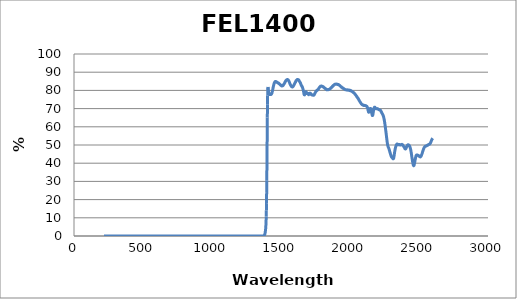
| Category | Series 0 |
|---|---|
| 2600.0 | 53.702 |
| 2599.0 | 53.601 |
| 2598.0 | 53.547 |
| 2597.0 | 53.429 |
| 2596.0 | 53.299 |
| 2595.0 | 53.191 |
| 2594.0 | 53.019 |
| 2593.0 | 52.975 |
| 2592.0 | 52.693 |
| 2591.0 | 52.558 |
| 2590.0 | 52.392 |
| 2589.0 | 52.176 |
| 2588.0 | 52.01 |
| 2587.0 | 51.898 |
| 2586.0 | 51.696 |
| 2585.0 | 51.437 |
| 2584.0 | 51.294 |
| 2583.0 | 51.16 |
| 2582.0 | 50.989 |
| 2581.0 | 50.836 |
| 2580.0 | 50.768 |
| 2579.0 | 50.635 |
| 2578.0 | 50.54 |
| 2577.0 | 50.472 |
| 2576.0 | 50.473 |
| 2575.0 | 50.437 |
| 2574.0 | 50.365 |
| 2573.0 | 50.402 |
| 2572.0 | 50.363 |
| 2571.0 | 50.339 |
| 2570.0 | 50.291 |
| 2569.0 | 50.251 |
| 2568.0 | 50.245 |
| 2567.0 | 50.118 |
| 2566.0 | 50.124 |
| 2565.0 | 50.035 |
| 2564.0 | 49.989 |
| 2563.0 | 49.877 |
| 2562.0 | 49.948 |
| 2561.0 | 49.817 |
| 2560.0 | 49.784 |
| 2559.0 | 49.782 |
| 2558.0 | 49.757 |
| 2557.0 | 49.689 |
| 2556.0 | 49.618 |
| 2555.0 | 49.544 |
| 2554.0 | 49.542 |
| 2553.0 | 49.45 |
| 2552.0 | 49.443 |
| 2551.0 | 49.421 |
| 2550.0 | 49.391 |
| 2549.0 | 49.399 |
| 2548.0 | 49.402 |
| 2547.0 | 49.347 |
| 2546.0 | 49.327 |
| 2545.0 | 49.232 |
| 2544.0 | 49.178 |
| 2543.0 | 49.087 |
| 2542.0 | 49.092 |
| 2541.0 | 48.93 |
| 2540.0 | 48.861 |
| 2539.0 | 48.759 |
| 2538.0 | 48.651 |
| 2537.0 | 48.433 |
| 2536.0 | 48.371 |
| 2535.0 | 48.127 |
| 2534.0 | 47.968 |
| 2533.0 | 47.78 |
| 2532.0 | 47.691 |
| 2531.0 | 47.353 |
| 2530.0 | 47.124 |
| 2529.0 | 46.902 |
| 2528.0 | 46.662 |
| 2527.0 | 46.427 |
| 2526.0 | 46.23 |
| 2525.0 | 45.944 |
| 2524.0 | 45.707 |
| 2523.0 | 45.471 |
| 2522.0 | 45.24 |
| 2521.0 | 45.029 |
| 2520.0 | 44.785 |
| 2519.0 | 44.584 |
| 2518.0 | 44.381 |
| 2517.0 | 44.177 |
| 2516.0 | 43.994 |
| 2515.0 | 43.894 |
| 2514.0 | 43.712 |
| 2513.0 | 43.629 |
| 2512.0 | 43.608 |
| 2511.0 | 43.536 |
| 2510.0 | 43.431 |
| 2509.0 | 43.492 |
| 2508.0 | 43.489 |
| 2507.0 | 43.487 |
| 2506.0 | 43.521 |
| 2505.0 | 43.594 |
| 2504.0 | 43.656 |
| 2503.0 | 43.727 |
| 2502.0 | 43.825 |
| 2501.0 | 43.916 |
| 2500.0 | 43.937 |
| 2499.0 | 44.09 |
| 2498.0 | 44.088 |
| 2497.0 | 44.07 |
| 2496.0 | 44.191 |
| 2495.0 | 44.239 |
| 2494.0 | 44.246 |
| 2493.0 | 44.307 |
| 2492.0 | 44.39 |
| 2491.0 | 44.416 |
| 2490.0 | 44.382 |
| 2489.0 | 44.427 |
| 2488.0 | 44.518 |
| 2487.0 | 44.522 |
| 2486.0 | 44.534 |
| 2485.0 | 44.558 |
| 2484.0 | 44.553 |
| 2483.0 | 44.551 |
| 2482.0 | 44.471 |
| 2481.0 | 44.379 |
| 2480.0 | 44.237 |
| 2479.0 | 44.136 |
| 2478.0 | 43.836 |
| 2477.0 | 43.573 |
| 2476.0 | 43.263 |
| 2475.0 | 42.968 |
| 2474.0 | 42.589 |
| 2473.0 | 42.219 |
| 2472.0 | 41.841 |
| 2471.0 | 41.418 |
| 2470.0 | 41.017 |
| 2469.0 | 40.601 |
| 2468.0 | 40.119 |
| 2467.0 | 39.754 |
| 2466.0 | 39.421 |
| 2465.0 | 39.109 |
| 2464.0 | 38.837 |
| 2463.0 | 38.701 |
| 2462.0 | 38.663 |
| 2461.0 | 38.625 |
| 2460.0 | 38.774 |
| 2459.0 | 38.909 |
| 2458.0 | 39.207 |
| 2457.0 | 39.498 |
| 2456.0 | 39.887 |
| 2455.0 | 40.297 |
| 2454.0 | 40.712 |
| 2453.0 | 41.162 |
| 2452.0 | 41.615 |
| 2451.0 | 42.094 |
| 2450.0 | 42.569 |
| 2449.0 | 43.072 |
| 2448.0 | 43.557 |
| 2447.0 | 44.132 |
| 2446.0 | 44.576 |
| 2445.0 | 45.125 |
| 2444.0 | 45.585 |
| 2443.0 | 46.081 |
| 2442.0 | 46.501 |
| 2441.0 | 47.038 |
| 2440.0 | 47.354 |
| 2439.0 | 47.697 |
| 2438.0 | 48.015 |
| 2437.0 | 48.326 |
| 2436.0 | 48.508 |
| 2435.0 | 48.773 |
| 2434.0 | 49.034 |
| 2433.0 | 49.145 |
| 2432.0 | 49.295 |
| 2431.0 | 49.508 |
| 2430.0 | 49.536 |
| 2429.0 | 49.692 |
| 2428.0 | 49.814 |
| 2427.0 | 49.871 |
| 2426.0 | 49.851 |
| 2425.0 | 50.009 |
| 2424.0 | 50.016 |
| 2423.0 | 50.088 |
| 2422.0 | 50.069 |
| 2421.0 | 50.087 |
| 2420.0 | 50.042 |
| 2419.0 | 50.082 |
| 2418.0 | 50.001 |
| 2417.0 | 49.943 |
| 2416.0 | 49.894 |
| 2415.0 | 49.777 |
| 2414.0 | 49.633 |
| 2413.0 | 49.535 |
| 2412.0 | 49.415 |
| 2411.0 | 49.127 |
| 2410.0 | 48.971 |
| 2409.0 | 48.805 |
| 2408.0 | 48.556 |
| 2407.0 | 48.387 |
| 2406.0 | 48.236 |
| 2405.0 | 48.041 |
| 2404.0 | 47.92 |
| 2403.0 | 47.913 |
| 2402.0 | 47.837 |
| 2401.0 | 47.801 |
| 2400.0 | 47.923 |
| 2399.0 | 47.939 |
| 2398.0 | 47.989 |
| 2397.0 | 48.216 |
| 2396.0 | 48.319 |
| 2395.0 | 48.439 |
| 2394.0 | 48.597 |
| 2393.0 | 48.72 |
| 2392.0 | 48.783 |
| 2391.0 | 48.99 |
| 2390.0 | 49.053 |
| 2389.0 | 49.16 |
| 2388.0 | 49.328 |
| 2387.0 | 49.449 |
| 2386.0 | 49.485 |
| 2385.0 | 49.695 |
| 2384.0 | 49.845 |
| 2383.0 | 49.955 |
| 2382.0 | 50.04 |
| 2381.0 | 50.152 |
| 2380.0 | 50.18 |
| 2379.0 | 50.259 |
| 2378.0 | 50.287 |
| 2377.0 | 50.271 |
| 2376.0 | 50.357 |
| 2375.0 | 50.312 |
| 2374.0 | 50.228 |
| 2373.0 | 50.235 |
| 2372.0 | 50.177 |
| 2371.0 | 50.13 |
| 2370.0 | 50.112 |
| 2369.0 | 50.102 |
| 2368.0 | 50.044 |
| 2367.0 | 49.996 |
| 2366.0 | 50.02 |
| 2365.0 | 49.943 |
| 2364.0 | 50.048 |
| 2363.0 | 49.992 |
| 2362.0 | 50.105 |
| 2361.0 | 50.245 |
| 2360.0 | 50.24 |
| 2359.0 | 50.237 |
| 2358.0 | 50.28 |
| 2357.0 | 50.328 |
| 2356.0 | 50.296 |
| 2355.0 | 50.299 |
| 2354.0 | 50.267 |
| 2353.0 | 50.155 |
| 2352.0 | 50.194 |
| 2351.0 | 50.153 |
| 2350.0 | 50.095 |
| 2349.0 | 50.14 |
| 2348.0 | 50.168 |
| 2347.0 | 50.264 |
| 2346.0 | 50.323 |
| 2345.0 | 50.406 |
| 2344.0 | 50.377 |
| 2343.0 | 50.515 |
| 2342.0 | 50.465 |
| 2341.0 | 50.538 |
| 2340.0 | 50.49 |
| 2339.0 | 50.446 |
| 2338.0 | 50.291 |
| 2337.0 | 50.193 |
| 2336.0 | 50.025 |
| 2335.0 | 49.855 |
| 2334.0 | 49.72 |
| 2333.0 | 49.43 |
| 2332.0 | 49.196 |
| 2331.0 | 48.976 |
| 2330.0 | 48.595 |
| 2329.0 | 48.341 |
| 2328.0 | 48.007 |
| 2327.0 | 47.59 |
| 2326.0 | 47.235 |
| 2325.0 | 46.799 |
| 2324.0 | 46.38 |
| 2323.0 | 45.818 |
| 2322.0 | 45.385 |
| 2321.0 | 44.869 |
| 2320.0 | 44.321 |
| 2319.0 | 43.798 |
| 2318.0 | 43.326 |
| 2317.0 | 42.976 |
| 2316.0 | 42.727 |
| 2315.0 | 42.508 |
| 2314.0 | 42.412 |
| 2313.0 | 42.399 |
| 2312.0 | 42.382 |
| 2311.0 | 42.454 |
| 2310.0 | 42.568 |
| 2309.0 | 42.69 |
| 2308.0 | 42.823 |
| 2307.0 | 42.949 |
| 2306.0 | 43.018 |
| 2305.0 | 43.118 |
| 2304.0 | 43.218 |
| 2303.0 | 43.294 |
| 2302.0 | 43.353 |
| 2301.0 | 43.447 |
| 2300.0 | 43.661 |
| 2299.0 | 43.764 |
| 2298.0 | 43.976 |
| 2297.0 | 44.143 |
| 2296.0 | 44.373 |
| 2295.0 | 44.61 |
| 2294.0 | 44.871 |
| 2293.0 | 45.141 |
| 2292.0 | 45.379 |
| 2291.0 | 45.649 |
| 2290.0 | 45.867 |
| 2289.0 | 46.181 |
| 2288.0 | 46.384 |
| 2287.0 | 46.658 |
| 2286.0 | 46.981 |
| 2285.0 | 47.227 |
| 2284.0 | 47.514 |
| 2283.0 | 47.764 |
| 2282.0 | 47.989 |
| 2281.0 | 48.185 |
| 2280.0 | 48.353 |
| 2279.0 | 48.596 |
| 2278.0 | 48.712 |
| 2277.0 | 48.9 |
| 2276.0 | 49.121 |
| 2275.0 | 49.358 |
| 2274.0 | 49.644 |
| 2273.0 | 49.866 |
| 2272.0 | 50.358 |
| 2271.0 | 50.798 |
| 2270.0 | 51.31 |
| 2269.0 | 51.858 |
| 2268.0 | 52.486 |
| 2267.0 | 53.139 |
| 2266.0 | 53.728 |
| 2265.0 | 54.295 |
| 2264.0 | 54.942 |
| 2263.0 | 55.612 |
| 2262.0 | 56.269 |
| 2261.0 | 56.829 |
| 2260.0 | 57.419 |
| 2259.0 | 58.092 |
| 2258.0 | 58.61 |
| 2257.0 | 59.296 |
| 2256.0 | 59.841 |
| 2255.0 | 60.39 |
| 2254.0 | 60.922 |
| 2253.0 | 61.48 |
| 2252.0 | 62.016 |
| 2251.0 | 62.532 |
| 2250.0 | 63.043 |
| 2249.0 | 63.442 |
| 2248.0 | 63.919 |
| 2247.0 | 64.271 |
| 2246.0 | 64.61 |
| 2245.0 | 64.955 |
| 2244.0 | 65.284 |
| 2243.0 | 65.604 |
| 2242.0 | 65.801 |
| 2241.0 | 66.024 |
| 2240.0 | 66.319 |
| 2239.0 | 66.426 |
| 2238.0 | 66.516 |
| 2237.0 | 66.764 |
| 2236.0 | 66.903 |
| 2235.0 | 67.03 |
| 2234.0 | 67.154 |
| 2233.0 | 67.25 |
| 2232.0 | 67.515 |
| 2231.0 | 67.563 |
| 2230.0 | 67.62 |
| 2229.0 | 67.87 |
| 2228.0 | 68.122 |
| 2227.0 | 68.139 |
| 2226.0 | 68.388 |
| 2225.0 | 68.56 |
| 2224.0 | 68.644 |
| 2223.0 | 68.755 |
| 2222.0 | 68.975 |
| 2221.0 | 69.09 |
| 2220.0 | 69.063 |
| 2219.0 | 69.168 |
| 2218.0 | 69.135 |
| 2217.0 | 69.209 |
| 2216.0 | 69.198 |
| 2215.0 | 69.284 |
| 2214.0 | 69.235 |
| 2213.0 | 69.357 |
| 2212.0 | 69.292 |
| 2211.0 | 69.335 |
| 2210.0 | 69.396 |
| 2209.0 | 69.394 |
| 2208.0 | 69.494 |
| 2207.0 | 69.577 |
| 2206.0 | 69.605 |
| 2205.0 | 69.555 |
| 2204.0 | 69.699 |
| 2203.0 | 69.766 |
| 2202.0 | 69.87 |
| 2201.0 | 69.893 |
| 2200.0 | 69.943 |
| 2199.0 | 69.955 |
| 2198.0 | 69.965 |
| 2197.0 | 69.998 |
| 2196.0 | 69.971 |
| 2195.0 | 69.924 |
| 2194.0 | 69.866 |
| 2193.0 | 69.872 |
| 2192.0 | 69.851 |
| 2191.0 | 69.867 |
| 2190.0 | 69.893 |
| 2189.0 | 69.903 |
| 2188.0 | 69.91 |
| 2187.0 | 69.973 |
| 2186.0 | 70.104 |
| 2185.0 | 70.167 |
| 2184.0 | 70.4 |
| 2183.0 | 70.479 |
| 2182.0 | 70.607 |
| 2181.0 | 70.65 |
| 2180.0 | 70.766 |
| 2179.0 | 70.795 |
| 2178.0 | 70.752 |
| 2177.0 | 70.751 |
| 2176.0 | 70.633 |
| 2175.0 | 70.412 |
| 2174.0 | 70.294 |
| 2173.0 | 69.939 |
| 2172.0 | 69.643 |
| 2171.0 | 69.256 |
| 2170.0 | 68.727 |
| 2169.0 | 68.196 |
| 2168.0 | 67.707 |
| 2167.0 | 67.207 |
| 2166.0 | 66.771 |
| 2165.0 | 66.41 |
| 2164.0 | 66.284 |
| 2163.0 | 66.179 |
| 2162.0 | 66.185 |
| 2161.0 | 66.331 |
| 2160.0 | 66.635 |
| 2159.0 | 66.974 |
| 2158.0 | 67.383 |
| 2157.0 | 67.844 |
| 2156.0 | 68.24 |
| 2155.0 | 68.618 |
| 2154.0 | 68.924 |
| 2153.0 | 69.322 |
| 2152.0 | 69.639 |
| 2151.0 | 69.846 |
| 2150.0 | 69.98 |
| 2149.0 | 70.102 |
| 2148.0 | 70.085 |
| 2147.0 | 70.085 |
| 2146.0 | 69.97 |
| 2145.0 | 69.873 |
| 2144.0 | 69.674 |
| 2143.0 | 69.441 |
| 2142.0 | 69.164 |
| 2141.0 | 68.973 |
| 2140.0 | 68.632 |
| 2139.0 | 68.452 |
| 2138.0 | 68.166 |
| 2137.0 | 68.04 |
| 2136.0 | 68.019 |
| 2135.0 | 68.016 |
| 2134.0 | 68.198 |
| 2133.0 | 68.499 |
| 2132.0 | 68.845 |
| 2131.0 | 69.085 |
| 2130.0 | 69.502 |
| 2129.0 | 69.898 |
| 2128.0 | 70.21 |
| 2127.0 | 70.489 |
| 2126.0 | 70.715 |
| 2125.0 | 70.869 |
| 2124.0 | 71.013 |
| 2123.0 | 71.106 |
| 2122.0 | 71.249 |
| 2121.0 | 71.257 |
| 2120.0 | 71.371 |
| 2119.0 | 71.297 |
| 2118.0 | 71.393 |
| 2117.0 | 71.388 |
| 2116.0 | 71.569 |
| 2115.0 | 71.507 |
| 2114.0 | 71.576 |
| 2113.0 | 71.591 |
| 2112.0 | 71.633 |
| 2111.0 | 71.683 |
| 2110.0 | 71.706 |
| 2109.0 | 71.67 |
| 2108.0 | 71.691 |
| 2107.0 | 71.729 |
| 2106.0 | 71.658 |
| 2105.0 | 71.681 |
| 2104.0 | 71.767 |
| 2103.0 | 71.766 |
| 2102.0 | 71.793 |
| 2101.0 | 71.754 |
| 2100.0 | 71.802 |
| 2099.0 | 71.793 |
| 2098.0 | 71.791 |
| 2097.0 | 71.836 |
| 2096.0 | 71.796 |
| 2095.0 | 71.971 |
| 2094.0 | 71.938 |
| 2093.0 | 71.971 |
| 2092.0 | 71.988 |
| 2091.0 | 72.074 |
| 2090.0 | 72.053 |
| 2089.0 | 72.216 |
| 2088.0 | 72.237 |
| 2087.0 | 72.292 |
| 2086.0 | 72.338 |
| 2085.0 | 72.408 |
| 2084.0 | 72.5 |
| 2083.0 | 72.575 |
| 2082.0 | 72.682 |
| 2081.0 | 72.758 |
| 2080.0 | 72.903 |
| 2079.0 | 73.033 |
| 2078.0 | 73.095 |
| 2077.0 | 73.219 |
| 2076.0 | 73.262 |
| 2075.0 | 73.483 |
| 2074.0 | 73.541 |
| 2073.0 | 73.726 |
| 2072.0 | 73.78 |
| 2071.0 | 73.949 |
| 2070.0 | 73.994 |
| 2069.0 | 74.149 |
| 2068.0 | 74.286 |
| 2067.0 | 74.426 |
| 2066.0 | 74.615 |
| 2065.0 | 74.786 |
| 2064.0 | 74.803 |
| 2063.0 | 74.955 |
| 2062.0 | 75.152 |
| 2061.0 | 75.234 |
| 2060.0 | 75.463 |
| 2059.0 | 75.488 |
| 2058.0 | 75.703 |
| 2057.0 | 75.833 |
| 2056.0 | 75.89 |
| 2055.0 | 75.928 |
| 2054.0 | 76.112 |
| 2053.0 | 76.122 |
| 2052.0 | 76.347 |
| 2051.0 | 76.428 |
| 2050.0 | 76.451 |
| 2049.0 | 76.57 |
| 2048.0 | 76.761 |
| 2047.0 | 76.925 |
| 2046.0 | 76.99 |
| 2045.0 | 77.014 |
| 2044.0 | 77.174 |
| 2043.0 | 77.308 |
| 2042.0 | 77.411 |
| 2041.0 | 77.512 |
| 2040.0 | 77.531 |
| 2039.0 | 77.699 |
| 2038.0 | 77.764 |
| 2037.0 | 77.85 |
| 2036.0 | 78.008 |
| 2035.0 | 78.179 |
| 2034.0 | 78.148 |
| 2033.0 | 78.31 |
| 2032.0 | 78.322 |
| 2031.0 | 78.415 |
| 2030.0 | 78.513 |
| 2029.0 | 78.603 |
| 2028.0 | 78.577 |
| 2027.0 | 78.73 |
| 2026.0 | 78.809 |
| 2025.0 | 78.861 |
| 2024.0 | 78.914 |
| 2023.0 | 78.914 |
| 2022.0 | 79.134 |
| 2021.0 | 79.072 |
| 2020.0 | 79.179 |
| 2019.0 | 79.202 |
| 2018.0 | 79.258 |
| 2017.0 | 79.34 |
| 2016.0 | 79.375 |
| 2015.0 | 79.41 |
| 2014.0 | 79.513 |
| 2013.0 | 79.549 |
| 2012.0 | 79.63 |
| 2011.0 | 79.647 |
| 2010.0 | 79.683 |
| 2009.0 | 79.671 |
| 2008.0 | 79.676 |
| 2007.0 | 79.902 |
| 2006.0 | 79.807 |
| 2005.0 | 79.878 |
| 2004.0 | 79.939 |
| 2003.0 | 79.801 |
| 2002.0 | 79.855 |
| 2001.0 | 79.888 |
| 2000.0 | 80.023 |
| 1999.0 | 80.088 |
| 1998.0 | 80.143 |
| 1997.0 | 79.948 |
| 1996.0 | 80.045 |
| 1995.0 | 80.077 |
| 1994.0 | 80.136 |
| 1993.0 | 80.09 |
| 1992.0 | 80.117 |
| 1991.0 | 80.176 |
| 1990.0 | 80.145 |
| 1989.0 | 80.153 |
| 1988.0 | 80.148 |
| 1987.0 | 80.234 |
| 1986.0 | 80.182 |
| 1985.0 | 80.228 |
| 1984.0 | 80.273 |
| 1983.0 | 80.207 |
| 1982.0 | 80.158 |
| 1981.0 | 80.312 |
| 1980.0 | 80.235 |
| 1979.0 | 80.245 |
| 1978.0 | 80.268 |
| 1977.0 | 80.159 |
| 1976.0 | 80.268 |
| 1975.0 | 80.244 |
| 1974.0 | 80.296 |
| 1973.0 | 80.248 |
| 1972.0 | 80.303 |
| 1971.0 | 80.319 |
| 1970.0 | 80.416 |
| 1969.0 | 80.322 |
| 1968.0 | 80.306 |
| 1967.0 | 80.393 |
| 1966.0 | 80.416 |
| 1965.0 | 80.506 |
| 1964.0 | 80.495 |
| 1963.0 | 80.545 |
| 1962.0 | 80.626 |
| 1961.0 | 80.644 |
| 1960.0 | 80.641 |
| 1959.0 | 80.737 |
| 1958.0 | 80.858 |
| 1957.0 | 80.822 |
| 1956.0 | 80.85 |
| 1955.0 | 80.943 |
| 1954.0 | 80.976 |
| 1953.0 | 81.023 |
| 1952.0 | 81.095 |
| 1951.0 | 81.042 |
| 1950.0 | 81.159 |
| 1949.0 | 81.309 |
| 1948.0 | 81.179 |
| 1947.0 | 81.306 |
| 1946.0 | 81.367 |
| 1945.0 | 81.346 |
| 1944.0 | 81.483 |
| 1943.0 | 81.479 |
| 1942.0 | 81.641 |
| 1941.0 | 81.599 |
| 1940.0 | 81.696 |
| 1939.0 | 81.713 |
| 1938.0 | 81.78 |
| 1937.0 | 81.971 |
| 1936.0 | 81.874 |
| 1935.0 | 82.086 |
| 1934.0 | 82.048 |
| 1933.0 | 82.211 |
| 1932.0 | 82.251 |
| 1931.0 | 82.312 |
| 1930.0 | 82.356 |
| 1929.0 | 82.474 |
| 1928.0 | 82.508 |
| 1927.0 | 82.61 |
| 1926.0 | 82.621 |
| 1925.0 | 82.714 |
| 1924.0 | 82.8 |
| 1923.0 | 82.805 |
| 1922.0 | 82.884 |
| 1921.0 | 82.869 |
| 1920.0 | 82.939 |
| 1919.0 | 83.107 |
| 1918.0 | 83.134 |
| 1917.0 | 83.083 |
| 1916.0 | 83.14 |
| 1915.0 | 83.241 |
| 1914.0 | 83.276 |
| 1913.0 | 83.122 |
| 1912.0 | 83.269 |
| 1911.0 | 83.315 |
| 1910.0 | 83.287 |
| 1909.0 | 83.385 |
| 1908.0 | 83.422 |
| 1907.0 | 83.417 |
| 1906.0 | 83.347 |
| 1905.0 | 83.365 |
| 1904.0 | 83.43 |
| 1903.0 | 83.409 |
| 1902.0 | 83.418 |
| 1901.0 | 83.43 |
| 1900.0 | 83.503 |
| 1899.0 | 83.467 |
| 1898.0 | 83.424 |
| 1897.0 | 83.46 |
| 1896.0 | 83.419 |
| 1895.0 | 83.407 |
| 1894.0 | 83.418 |
| 1893.0 | 83.362 |
| 1892.0 | 83.35 |
| 1891.0 | 83.384 |
| 1890.0 | 83.351 |
| 1889.0 | 83.287 |
| 1888.0 | 83.319 |
| 1887.0 | 83.153 |
| 1886.0 | 83.071 |
| 1885.0 | 83.084 |
| 1884.0 | 83.01 |
| 1883.0 | 82.862 |
| 1882.0 | 82.867 |
| 1881.0 | 82.818 |
| 1880.0 | 82.687 |
| 1879.0 | 82.738 |
| 1878.0 | 82.585 |
| 1877.0 | 82.437 |
| 1876.0 | 82.457 |
| 1875.0 | 82.306 |
| 1874.0 | 82.265 |
| 1873.0 | 82.17 |
| 1872.0 | 82.013 |
| 1871.0 | 81.983 |
| 1870.0 | 81.988 |
| 1869.0 | 81.758 |
| 1868.0 | 81.776 |
| 1867.0 | 81.651 |
| 1866.0 | 81.633 |
| 1865.0 | 81.625 |
| 1864.0 | 81.46 |
| 1863.0 | 81.471 |
| 1862.0 | 81.328 |
| 1861.0 | 81.276 |
| 1860.0 | 81.161 |
| 1859.0 | 81.15 |
| 1858.0 | 81.01 |
| 1857.0 | 81.038 |
| 1856.0 | 80.938 |
| 1855.0 | 80.874 |
| 1854.0 | 80.75 |
| 1853.0 | 80.801 |
| 1852.0 | 80.657 |
| 1851.0 | 80.638 |
| 1850.0 | 80.59 |
| 1849.0 | 80.585 |
| 1848.0 | 80.541 |
| 1847.0 | 80.463 |
| 1846.0 | 80.429 |
| 1845.0 | 80.458 |
| 1844.0 | 80.443 |
| 1843.0 | 80.368 |
| 1842.0 | 80.377 |
| 1841.0 | 80.418 |
| 1840.0 | 80.395 |
| 1839.0 | 80.367 |
| 1838.0 | 80.408 |
| 1837.0 | 80.435 |
| 1836.0 | 80.438 |
| 1835.0 | 80.458 |
| 1834.0 | 80.499 |
| 1833.0 | 80.475 |
| 1832.0 | 80.422 |
| 1831.0 | 80.342 |
| 1830.0 | 80.588 |
| 1829.0 | 80.546 |
| 1828.0 | 80.57 |
| 1827.0 | 80.608 |
| 1826.0 | 80.7 |
| 1825.0 | 80.745 |
| 1824.0 | 80.891 |
| 1823.0 | 80.906 |
| 1822.0 | 80.845 |
| 1821.0 | 80.966 |
| 1820.0 | 81.098 |
| 1819.0 | 81.162 |
| 1818.0 | 81.155 |
| 1817.0 | 81.191 |
| 1816.0 | 81.378 |
| 1815.0 | 81.253 |
| 1814.0 | 81.407 |
| 1813.0 | 81.47 |
| 1812.0 | 81.567 |
| 1811.0 | 81.625 |
| 1810.0 | 81.659 |
| 1809.0 | 81.777 |
| 1808.0 | 81.929 |
| 1807.0 | 81.84 |
| 1806.0 | 81.839 |
| 1805.0 | 81.958 |
| 1804.0 | 82.097 |
| 1803.0 | 82.068 |
| 1802.0 | 82.096 |
| 1801.0 | 82.117 |
| 1800.0 | 82.174 |
| 1799.0 | 82.226 |
| 1798.0 | 82.298 |
| 1797.0 | 82.328 |
| 1796.0 | 82.351 |
| 1795.0 | 82.292 |
| 1794.0 | 82.392 |
| 1793.0 | 82.357 |
| 1792.0 | 82.412 |
| 1791.0 | 82.312 |
| 1790.0 | 82.339 |
| 1789.0 | 82.337 |
| 1788.0 | 82.348 |
| 1787.0 | 82.299 |
| 1786.0 | 82.299 |
| 1785.0 | 82.091 |
| 1784.0 | 82.151 |
| 1783.0 | 82.109 |
| 1782.0 | 81.995 |
| 1781.0 | 81.956 |
| 1780.0 | 81.819 |
| 1779.0 | 81.654 |
| 1778.0 | 81.511 |
| 1777.0 | 81.466 |
| 1776.0 | 81.379 |
| 1775.0 | 81.222 |
| 1774.0 | 81.121 |
| 1773.0 | 81.051 |
| 1772.0 | 80.804 |
| 1771.0 | 80.714 |
| 1770.0 | 80.562 |
| 1769.0 | 80.576 |
| 1768.0 | 80.408 |
| 1767.0 | 80.335 |
| 1766.0 | 80.293 |
| 1765.0 | 80.266 |
| 1764.0 | 80.189 |
| 1763.0 | 80.227 |
| 1762.0 | 80.137 |
| 1761.0 | 80.069 |
| 1760.0 | 79.908 |
| 1759.0 | 79.898 |
| 1758.0 | 79.823 |
| 1757.0 | 79.782 |
| 1756.0 | 79.693 |
| 1755.0 | 79.58 |
| 1754.0 | 79.588 |
| 1753.0 | 79.359 |
| 1752.0 | 79.292 |
| 1751.0 | 79.062 |
| 1750.0 | 79.001 |
| 1749.0 | 78.972 |
| 1748.0 | 78.74 |
| 1747.0 | 78.56 |
| 1746.0 | 78.5 |
| 1745.0 | 78.278 |
| 1744.0 | 78.115 |
| 1743.0 | 78.016 |
| 1742.0 | 77.822 |
| 1741.0 | 77.638 |
| 1740.0 | 77.564 |
| 1739.0 | 77.433 |
| 1738.0 | 77.441 |
| 1737.0 | 77.404 |
| 1736.0 | 77.322 |
| 1735.0 | 77.345 |
| 1734.0 | 77.293 |
| 1733.0 | 77.324 |
| 1732.0 | 77.354 |
| 1731.0 | 77.463 |
| 1730.0 | 77.426 |
| 1729.0 | 77.479 |
| 1728.0 | 77.51 |
| 1727.0 | 77.52 |
| 1726.0 | 77.519 |
| 1725.0 | 77.446 |
| 1724.0 | 77.631 |
| 1723.0 | 77.576 |
| 1722.0 | 77.593 |
| 1721.0 | 77.632 |
| 1720.0 | 77.687 |
| 1719.0 | 77.773 |
| 1718.0 | 77.832 |
| 1717.0 | 78.051 |
| 1716.0 | 78.157 |
| 1715.0 | 78.245 |
| 1714.0 | 78.324 |
| 1713.0 | 78.474 |
| 1712.0 | 78.34 |
| 1711.0 | 78.476 |
| 1710.0 | 78.418 |
| 1709.0 | 78.356 |
| 1708.0 | 78.441 |
| 1707.0 | 78.214 |
| 1706.0 | 78.21 |
| 1705.0 | 78.139 |
| 1704.0 | 77.993 |
| 1703.0 | 77.925 |
| 1702.0 | 77.857 |
| 1701.0 | 77.664 |
| 1700.0 | 77.75 |
| 1699.0 | 77.715 |
| 1698.0 | 77.906 |
| 1697.0 | 78.066 |
| 1696.0 | 78.259 |
| 1695.0 | 78.324 |
| 1694.0 | 78.376 |
| 1693.0 | 78.389 |
| 1692.0 | 78.234 |
| 1691.0 | 78.219 |
| 1690.0 | 78.224 |
| 1689.0 | 78.228 |
| 1688.0 | 78.289 |
| 1687.0 | 78.351 |
| 1686.0 | 78.454 |
| 1685.0 | 78.729 |
| 1684.0 | 78.91 |
| 1683.0 | 79.062 |
| 1682.0 | 79.256 |
| 1681.0 | 79.315 |
| 1680.0 | 79.267 |
| 1679.0 | 79.208 |
| 1678.0 | 79.081 |
| 1677.0 | 78.869 |
| 1676.0 | 78.637 |
| 1675.0 | 78.412 |
| 1674.0 | 78.187 |
| 1673.0 | 78.015 |
| 1672.0 | 77.813 |
| 1671.0 | 77.544 |
| 1670.0 | 77.687 |
| 1669.0 | 77.591 |
| 1668.0 | 77.672 |
| 1667.0 | 77.916 |
| 1666.0 | 78.288 |
| 1665.0 | 78.736 |
| 1664.0 | 79.116 |
| 1663.0 | 79.542 |
| 1662.0 | 79.911 |
| 1661.0 | 80.235 |
| 1660.0 | 80.531 |
| 1659.0 | 80.841 |
| 1658.0 | 81.083 |
| 1657.0 | 81.284 |
| 1656.0 | 81.573 |
| 1655.0 | 81.774 |
| 1654.0 | 81.917 |
| 1653.0 | 82.04 |
| 1652.0 | 82.187 |
| 1651.0 | 82.362 |
| 1650.0 | 82.366 |
| 1649.0 | 82.51 |
| 1648.0 | 82.644 |
| 1647.0 | 82.78 |
| 1646.0 | 83.105 |
| 1645.0 | 83.163 |
| 1644.0 | 83.415 |
| 1643.0 | 83.588 |
| 1642.0 | 83.938 |
| 1641.0 | 83.915 |
| 1640.0 | 84.205 |
| 1639.0 | 84.339 |
| 1638.0 | 84.522 |
| 1637.0 | 84.573 |
| 1636.0 | 84.681 |
| 1635.0 | 84.867 |
| 1634.0 | 84.928 |
| 1633.0 | 85.067 |
| 1632.0 | 85.138 |
| 1631.0 | 85.445 |
| 1630.0 | 85.414 |
| 1629.0 | 85.656 |
| 1628.0 | 85.653 |
| 1627.0 | 85.813 |
| 1626.0 | 85.771 |
| 1625.0 | 85.905 |
| 1624.0 | 85.973 |
| 1623.0 | 85.953 |
| 1622.0 | 85.893 |
| 1621.0 | 85.943 |
| 1620.0 | 85.941 |
| 1619.0 | 86.007 |
| 1618.0 | 85.903 |
| 1617.0 | 85.776 |
| 1616.0 | 85.793 |
| 1615.0 | 85.841 |
| 1614.0 | 85.685 |
| 1613.0 | 85.705 |
| 1612.0 | 85.534 |
| 1611.0 | 85.422 |
| 1610.0 | 85.417 |
| 1609.0 | 85.289 |
| 1608.0 | 85.185 |
| 1607.0 | 84.957 |
| 1606.0 | 84.863 |
| 1605.0 | 84.526 |
| 1604.0 | 84.559 |
| 1603.0 | 84.395 |
| 1602.0 | 84.245 |
| 1601.0 | 84.028 |
| 1600.0 | 83.866 |
| 1599.0 | 83.726 |
| 1598.0 | 83.63 |
| 1597.0 | 83.517 |
| 1596.0 | 83.272 |
| 1595.0 | 83.126 |
| 1594.0 | 83.028 |
| 1593.0 | 82.892 |
| 1592.0 | 82.602 |
| 1591.0 | 82.645 |
| 1590.0 | 82.458 |
| 1589.0 | 82.364 |
| 1588.0 | 82.222 |
| 1587.0 | 82.182 |
| 1586.0 | 81.984 |
| 1585.0 | 82.105 |
| 1584.0 | 81.975 |
| 1583.0 | 81.875 |
| 1582.0 | 81.997 |
| 1581.0 | 82.022 |
| 1580.0 | 81.917 |
| 1579.0 | 81.996 |
| 1578.0 | 82.065 |
| 1577.0 | 82.181 |
| 1576.0 | 82.129 |
| 1575.0 | 82.281 |
| 1574.0 | 82.341 |
| 1573.0 | 82.458 |
| 1572.0 | 82.51 |
| 1571.0 | 82.686 |
| 1570.0 | 82.941 |
| 1569.0 | 83.058 |
| 1568.0 | 83.16 |
| 1567.0 | 83.375 |
| 1566.0 | 83.474 |
| 1565.0 | 83.693 |
| 1564.0 | 83.851 |
| 1563.0 | 84.007 |
| 1562.0 | 84.262 |
| 1561.0 | 84.378 |
| 1560.0 | 84.596 |
| 1559.0 | 84.781 |
| 1558.0 | 84.954 |
| 1557.0 | 85.166 |
| 1556.0 | 85.274 |
| 1555.0 | 85.36 |
| 1554.0 | 85.464 |
| 1553.0 | 85.596 |
| 1552.0 | 85.718 |
| 1551.0 | 85.758 |
| 1550.0 | 85.871 |
| 1549.0 | 85.824 |
| 1548.0 | 85.888 |
| 1547.0 | 85.955 |
| 1546.0 | 85.974 |
| 1545.0 | 85.867 |
| 1544.0 | 85.892 |
| 1543.0 | 85.898 |
| 1542.0 | 85.788 |
| 1541.0 | 85.753 |
| 1540.0 | 85.758 |
| 1539.0 | 85.666 |
| 1538.0 | 85.539 |
| 1537.0 | 85.421 |
| 1536.0 | 85.422 |
| 1535.0 | 85.28 |
| 1534.0 | 85.259 |
| 1533.0 | 84.99 |
| 1532.0 | 84.867 |
| 1531.0 | 84.75 |
| 1530.0 | 84.616 |
| 1529.0 | 84.6 |
| 1528.0 | 84.286 |
| 1527.0 | 84.168 |
| 1526.0 | 84.044 |
| 1525.0 | 83.947 |
| 1524.0 | 83.797 |
| 1523.0 | 83.599 |
| 1522.0 | 83.518 |
| 1521.0 | 83.425 |
| 1520.0 | 83.276 |
| 1519.0 | 83.165 |
| 1518.0 | 83.015 |
| 1517.0 | 82.919 |
| 1516.0 | 82.941 |
| 1515.0 | 82.713 |
| 1514.0 | 82.646 |
| 1513.0 | 82.674 |
| 1512.0 | 82.577 |
| 1511.0 | 82.523 |
| 1510.0 | 82.478 |
| 1509.0 | 82.53 |
| 1508.0 | 82.455 |
| 1507.0 | 82.451 |
| 1506.0 | 82.414 |
| 1505.0 | 82.621 |
| 1504.0 | 82.522 |
| 1503.0 | 82.697 |
| 1502.0 | 82.599 |
| 1501.0 | 82.707 |
| 1500.0 | 82.696 |
| 1499.0 | 82.839 |
| 1498.0 | 82.821 |
| 1497.0 | 82.958 |
| 1496.0 | 82.928 |
| 1495.0 | 83.161 |
| 1494.0 | 83.246 |
| 1493.0 | 83.139 |
| 1492.0 | 83.373 |
| 1491.0 | 83.329 |
| 1490.0 | 83.476 |
| 1489.0 | 83.569 |
| 1488.0 | 83.558 |
| 1487.0 | 83.722 |
| 1486.0 | 83.654 |
| 1485.0 | 83.773 |
| 1484.0 | 83.899 |
| 1483.0 | 83.802 |
| 1482.0 | 84.033 |
| 1481.0 | 83.968 |
| 1480.0 | 84.061 |
| 1479.0 | 84.048 |
| 1478.0 | 84.077 |
| 1477.0 | 84.181 |
| 1476.0 | 84.243 |
| 1475.0 | 84.335 |
| 1474.0 | 84.258 |
| 1473.0 | 84.359 |
| 1472.0 | 84.457 |
| 1471.0 | 84.423 |
| 1470.0 | 84.51 |
| 1469.0 | 84.5 |
| 1468.0 | 84.583 |
| 1467.0 | 84.719 |
| 1466.0 | 84.669 |
| 1465.0 | 84.699 |
| 1464.0 | 84.802 |
| 1463.0 | 84.844 |
| 1462.0 | 84.843 |
| 1461.0 | 84.821 |
| 1460.0 | 84.934 |
| 1459.0 | 84.809 |
| 1458.0 | 84.863 |
| 1457.0 | 84.761 |
| 1456.0 | 84.788 |
| 1455.0 | 84.575 |
| 1454.0 | 84.477 |
| 1453.0 | 84.233 |
| 1452.0 | 84.168 |
| 1451.0 | 84.007 |
| 1450.0 | 83.809 |
| 1449.0 | 83.478 |
| 1448.0 | 83.19 |
| 1447.0 | 82.967 |
| 1446.0 | 82.575 |
| 1445.0 | 82.384 |
| 1444.0 | 81.879 |
| 1443.0 | 81.598 |
| 1442.0 | 81.16 |
| 1441.0 | 80.777 |
| 1440.0 | 80.391 |
| 1439.0 | 80.075 |
| 1438.0 | 79.671 |
| 1437.0 | 79.363 |
| 1436.0 | 79.186 |
| 1435.0 | 78.777 |
| 1434.0 | 78.51 |
| 1433.0 | 78.418 |
| 1432.0 | 78.199 |
| 1431.0 | 78.017 |
| 1430.0 | 77.933 |
| 1429.0 | 77.842 |
| 1428.0 | 77.813 |
| 1427.0 | 77.772 |
| 1426.0 | 77.831 |
| 1425.0 | 77.84 |
| 1424.0 | 77.825 |
| 1423.0 | 77.852 |
| 1422.0 | 77.797 |
| 1421.0 | 77.865 |
| 1420.0 | 77.93 |
| 1419.0 | 77.841 |
| 1418.0 | 77.864 |
| 1417.0 | 77.757 |
| 1416.0 | 77.761 |
| 1415.0 | 77.788 |
| 1414.0 | 77.865 |
| 1413.0 | 78.041 |
| 1412.0 | 78.273 |
| 1411.0 | 78.679 |
| 1410.0 | 79.225 |
| 1409.0 | 80.044 |
| 1408.0 | 80.762 |
| 1407.0 | 81.396 |
| 1406.0 | 81.877 |
| 1405.0 | 81.362 |
| 1404.0 | 80.038 |
| 1403.0 | 77.125 |
| 1402.0 | 72.118 |
| 1401.0 | 65.045 |
| 1400.0 | 56.61 |
| 1399.0 | 47.223 |
| 1398.0 | 38.425 |
| 1397.0 | 30.581 |
| 1396.0 | 23.692 |
| 1395.0 | 18.064 |
| 1394.0 | 13.885 |
| 1393.0 | 10.74 |
| 1392.0 | 8.306 |
| 1391.0 | 6.553 |
| 1390.0 | 5.197 |
| 1389.0 | 4.147 |
| 1388.0 | 3.418 |
| 1387.0 | 2.805 |
| 1386.0 | 2.174 |
| 1385.0 | 1.67 |
| 1384.0 | 1.303 |
| 1383.0 | 1.005 |
| 1382.0 | 0.782 |
| 1381.0 | 0.617 |
| 1380.0 | 0.485 |
| 1379.0 | 0.384 |
| 1378.0 | 0.306 |
| 1377.0 | 0.245 |
| 1376.0 | 0.197 |
| 1375.0 | 0.16 |
| 1374.0 | 0.132 |
| 1373.0 | 0.108 |
| 1372.0 | 0.089 |
| 1371.0 | 0.073 |
| 1370.0 | 0.06 |
| 1369.0 | 0.05 |
| 1368.0 | 0.042 |
| 1367.0 | 0.035 |
| 1366.0 | 0.029 |
| 1365.0 | 0.024 |
| 1364.0 | 0.02 |
| 1363.0 | 0.017 |
| 1362.0 | 0.014 |
| 1361.0 | 0.012 |
| 1360.0 | 0.01 |
| 1359.0 | 0.009 |
| 1358.0 | 0.008 |
| 1357.0 | 0.006 |
| 1356.0 | 0.006 |
| 1355.0 | 0.005 |
| 1354.0 | 0.004 |
| 1353.0 | 0.004 |
| 1352.0 | 0.003 |
| 1351.0 | 0.003 |
| 1350.0 | 0.002 |
| 1349.0 | 0.002 |
| 1348.0 | 0.002 |
| 1347.0 | 0.002 |
| 1346.0 | 0.001 |
| 1345.0 | 0.001 |
| 1344.0 | 0.001 |
| 1343.0 | 0.001 |
| 1342.0 | 0.001 |
| 1341.0 | 0.001 |
| 1340.0 | 0.001 |
| 1339.0 | 0.001 |
| 1338.0 | 0.001 |
| 1337.0 | 0.001 |
| 1336.0 | 0 |
| 1335.0 | 0 |
| 1334.0 | 0 |
| 1333.0 | 0 |
| 1332.0 | 0 |
| 1331.0 | 0 |
| 1330.0 | 0 |
| 1329.0 | 0 |
| 1328.0 | 0 |
| 1327.0 | 0 |
| 1326.0 | 0 |
| 1325.0 | 0 |
| 1324.0 | 0 |
| 1323.0 | 0 |
| 1322.0 | 0 |
| 1321.0 | 0 |
| 1320.0 | 0 |
| 1319.0 | 0 |
| 1318.0 | 0 |
| 1317.0 | 0 |
| 1316.0 | 0 |
| 1315.0 | 0 |
| 1314.0 | 0 |
| 1313.0 | 0 |
| 1312.0 | 0 |
| 1311.0 | 0 |
| 1310.0 | 0 |
| 1309.0 | 0 |
| 1308.0 | 0 |
| 1307.0 | 0 |
| 1306.0 | 0 |
| 1305.0 | 0 |
| 1304.0 | 0 |
| 1303.0 | 0 |
| 1302.0 | 0 |
| 1301.0 | 0 |
| 1300.0 | 0 |
| 1299.0 | 0 |
| 1298.0 | 0 |
| 1297.0 | 0 |
| 1296.0 | 0 |
| 1295.0 | 0 |
| 1294.0 | 0 |
| 1293.0 | 0 |
| 1292.0 | 0 |
| 1291.0 | 0 |
| 1290.0 | 0 |
| 1289.0 | 0 |
| 1288.0 | 0 |
| 1287.0 | 0 |
| 1286.0 | 0 |
| 1285.0 | 0 |
| 1284.0 | 0 |
| 1283.0 | 0 |
| 1282.0 | 0 |
| 1281.0 | 0 |
| 1280.0 | 0 |
| 1279.0 | 0 |
| 1278.0 | 0 |
| 1277.0 | 0 |
| 1276.0 | 0 |
| 1275.0 | 0 |
| 1274.0 | 0 |
| 1273.0 | 0 |
| 1272.0 | 0 |
| 1271.0 | 0 |
| 1270.0 | 0 |
| 1269.0 | 0 |
| 1268.0 | 0 |
| 1267.0 | 0 |
| 1266.0 | 0 |
| 1265.0 | 0 |
| 1264.0 | 0 |
| 1263.0 | 0 |
| 1262.0 | 0 |
| 1261.0 | 0 |
| 1260.0 | 0 |
| 1259.0 | 0 |
| 1258.0 | 0 |
| 1257.0 | 0 |
| 1256.0 | 0 |
| 1255.0 | 0 |
| 1254.0 | 0 |
| 1253.0 | 0 |
| 1252.0 | 0 |
| 1251.0 | 0 |
| 1250.0 | 0 |
| 1249.0 | 0 |
| 1248.0 | 0 |
| 1247.0 | 0 |
| 1246.0 | 0 |
| 1245.0 | 0 |
| 1244.0 | 0 |
| 1243.0 | 0 |
| 1242.0 | 0 |
| 1241.0 | 0 |
| 1240.0 | 0 |
| 1239.0 | 0 |
| 1238.0 | 0 |
| 1237.0 | 0 |
| 1236.0 | 0 |
| 1235.0 | 0 |
| 1234.0 | 0 |
| 1233.0 | 0 |
| 1232.0 | 0 |
| 1231.0 | 0 |
| 1230.0 | 0 |
| 1229.0 | 0 |
| 1228.0 | 0 |
| 1227.0 | 0 |
| 1226.0 | 0 |
| 1225.0 | 0 |
| 1224.0 | 0 |
| 1223.0 | 0 |
| 1222.0 | 0 |
| 1221.0 | 0 |
| 1220.0 | 0 |
| 1219.0 | 0 |
| 1218.0 | 0 |
| 1217.0 | 0 |
| 1216.0 | 0 |
| 1215.0 | 0 |
| 1214.0 | 0 |
| 1213.0 | 0 |
| 1212.0 | 0 |
| 1211.0 | 0 |
| 1210.0 | 0 |
| 1209.0 | 0 |
| 1208.0 | 0 |
| 1207.0 | 0 |
| 1206.0 | 0 |
| 1205.0 | 0 |
| 1204.0 | 0 |
| 1203.0 | 0 |
| 1202.0 | 0 |
| 1201.0 | 0 |
| 1200.0 | 0 |
| 1199.0 | 0 |
| 1198.0 | 0 |
| 1197.0 | 0 |
| 1196.0 | 0 |
| 1195.0 | 0 |
| 1194.0 | 0 |
| 1193.0 | 0 |
| 1192.0 | 0 |
| 1191.0 | 0 |
| 1190.0 | 0 |
| 1189.0 | 0 |
| 1188.0 | 0 |
| 1187.0 | 0 |
| 1186.0 | 0 |
| 1185.0 | 0 |
| 1184.0 | 0 |
| 1183.0 | 0 |
| 1182.0 | 0 |
| 1181.0 | 0 |
| 1180.0 | 0 |
| 1179.0 | 0 |
| 1178.0 | 0 |
| 1177.0 | 0 |
| 1176.0 | 0 |
| 1175.0 | 0 |
| 1174.0 | 0 |
| 1173.0 | 0 |
| 1172.0 | 0 |
| 1171.0 | 0 |
| 1170.0 | 0 |
| 1169.0 | 0 |
| 1168.0 | 0 |
| 1167.0 | 0 |
| 1166.0 | 0 |
| 1165.0 | 0 |
| 1164.0 | 0 |
| 1163.0 | 0 |
| 1162.0 | 0 |
| 1161.0 | 0 |
| 1160.0 | 0 |
| 1159.0 | 0 |
| 1158.0 | 0 |
| 1157.0 | 0 |
| 1156.0 | 0 |
| 1155.0 | 0 |
| 1154.0 | 0 |
| 1153.0 | 0 |
| 1152.0 | 0 |
| 1151.0 | 0 |
| 1150.0 | 0 |
| 1149.0 | 0 |
| 1148.0 | 0 |
| 1147.0 | 0 |
| 1146.0 | 0 |
| 1145.0 | 0 |
| 1144.0 | 0 |
| 1143.0 | 0 |
| 1142.0 | 0 |
| 1141.0 | 0 |
| 1140.0 | 0 |
| 1139.0 | 0 |
| 1138.0 | 0 |
| 1137.0 | 0 |
| 1136.0 | 0 |
| 1135.0 | 0 |
| 1134.0 | 0 |
| 1133.0 | 0 |
| 1132.0 | 0 |
| 1131.0 | 0 |
| 1130.0 | 0 |
| 1129.0 | 0 |
| 1128.0 | 0 |
| 1127.0 | 0 |
| 1126.0 | 0 |
| 1125.0 | 0 |
| 1124.0 | 0 |
| 1123.0 | 0 |
| 1122.0 | 0 |
| 1121.0 | 0 |
| 1120.0 | 0 |
| 1119.0 | 0 |
| 1118.0 | 0 |
| 1117.0 | 0 |
| 1116.0 | 0 |
| 1115.0 | 0 |
| 1114.0 | 0 |
| 1113.0 | 0 |
| 1112.0 | 0 |
| 1111.0 | 0 |
| 1110.0 | 0 |
| 1109.0 | 0 |
| 1108.0 | 0 |
| 1107.0 | 0 |
| 1106.0 | 0 |
| 1105.0 | 0 |
| 1104.0 | 0 |
| 1103.0 | 0 |
| 1102.0 | 0 |
| 1101.0 | 0 |
| 1100.0 | 0 |
| 1099.0 | 0 |
| 1098.0 | 0 |
| 1097.0 | 0 |
| 1096.0 | 0 |
| 1095.0 | 0 |
| 1094.0 | 0 |
| 1093.0 | 0 |
| 1092.0 | 0 |
| 1091.0 | 0 |
| 1090.0 | 0 |
| 1089.0 | 0 |
| 1088.0 | 0 |
| 1087.0 | 0 |
| 1086.0 | 0 |
| 1085.0 | 0 |
| 1084.0 | 0 |
| 1083.0 | 0 |
| 1082.0 | 0 |
| 1081.0 | 0 |
| 1080.0 | 0 |
| 1079.0 | 0 |
| 1078.0 | 0 |
| 1077.0 | 0 |
| 1076.0 | 0 |
| 1075.0 | 0 |
| 1074.0 | 0 |
| 1073.0 | 0 |
| 1072.0 | 0 |
| 1071.0 | 0 |
| 1070.0 | 0 |
| 1069.0 | 0 |
| 1068.0 | 0 |
| 1067.0 | 0 |
| 1066.0 | 0 |
| 1065.0 | 0 |
| 1064.0 | 0 |
| 1063.0 | 0 |
| 1062.0 | 0 |
| 1061.0 | 0 |
| 1060.0 | 0 |
| 1059.0 | 0 |
| 1058.0 | 0 |
| 1057.0 | 0 |
| 1056.0 | 0 |
| 1055.0 | 0 |
| 1054.0 | 0 |
| 1053.0 | 0 |
| 1052.0 | 0 |
| 1051.0 | 0 |
| 1050.0 | 0 |
| 1049.0 | 0 |
| 1048.0 | 0 |
| 1047.0 | 0 |
| 1046.0 | 0 |
| 1045.0 | 0 |
| 1044.0 | 0 |
| 1043.0 | 0 |
| 1042.0 | 0 |
| 1041.0 | 0 |
| 1040.0 | 0 |
| 1039.0 | 0 |
| 1038.0 | 0 |
| 1037.0 | 0 |
| 1036.0 | 0 |
| 1035.0 | 0 |
| 1034.0 | 0 |
| 1033.0 | 0 |
| 1032.0 | 0 |
| 1031.0 | 0 |
| 1030.0 | 0 |
| 1029.0 | 0 |
| 1028.0 | 0 |
| 1027.0 | 0 |
| 1026.0 | 0 |
| 1025.0 | 0 |
| 1024.0 | 0 |
| 1023.0 | 0 |
| 1022.0 | 0 |
| 1021.0 | 0 |
| 1020.0 | 0 |
| 1019.0 | 0 |
| 1018.0 | 0 |
| 1017.0 | 0 |
| 1016.0 | 0 |
| 1015.0 | 0 |
| 1014.0 | 0 |
| 1013.0 | 0 |
| 1012.0 | 0 |
| 1011.0 | 0 |
| 1010.0 | 0 |
| 1009.0 | 0 |
| 1008.0 | 0 |
| 1007.0 | 0 |
| 1006.0 | 0 |
| 1005.0 | 0 |
| 1004.0 | 0 |
| 1003.0 | 0 |
| 1002.0 | 0 |
| 1001.0 | 0 |
| 1000.0 | 0 |
| 999.0 | 0 |
| 998.0 | 0 |
| 997.0 | 0 |
| 996.0 | 0 |
| 995.0 | 0 |
| 994.0 | 0 |
| 993.0 | 0 |
| 992.0 | 0 |
| 991.0 | 0 |
| 990.0 | 0 |
| 989.0 | 0 |
| 988.0 | 0 |
| 987.0 | 0 |
| 986.0 | 0 |
| 985.0 | 0 |
| 984.0 | 0 |
| 983.0 | 0 |
| 982.0 | 0 |
| 981.0 | 0 |
| 980.0 | 0 |
| 979.0 | 0 |
| 978.0 | 0 |
| 977.0 | 0 |
| 976.0 | 0 |
| 975.0 | 0 |
| 974.0 | 0 |
| 973.0 | 0 |
| 972.0 | 0 |
| 971.0 | 0 |
| 970.0 | 0 |
| 969.0 | 0 |
| 968.0 | 0 |
| 967.0 | 0 |
| 966.0 | 0 |
| 965.0 | 0 |
| 964.0 | 0 |
| 963.0 | 0 |
| 962.0 | 0 |
| 961.0 | 0 |
| 960.0 | 0 |
| 959.0 | 0 |
| 958.0 | 0 |
| 957.0 | 0 |
| 956.0 | 0 |
| 955.0 | 0 |
| 954.0 | 0 |
| 953.0 | 0 |
| 952.0 | 0 |
| 951.0 | 0 |
| 950.0 | 0 |
| 949.0 | 0 |
| 948.0 | 0 |
| 947.0 | 0 |
| 946.0 | 0 |
| 945.0 | 0 |
| 944.0 | 0 |
| 943.0 | 0 |
| 942.0 | 0 |
| 941.0 | 0 |
| 940.0 | 0 |
| 939.0 | 0 |
| 938.0 | 0 |
| 937.0 | 0 |
| 936.0 | 0 |
| 935.0 | 0 |
| 934.0 | 0 |
| 933.0 | 0 |
| 932.0 | 0 |
| 931.0 | 0 |
| 930.0 | 0 |
| 929.0 | 0 |
| 928.0 | 0 |
| 927.0 | 0 |
| 926.0 | 0 |
| 925.0 | 0 |
| 924.0 | 0 |
| 923.0 | 0 |
| 922.0 | 0 |
| 921.0 | 0 |
| 920.0 | 0 |
| 919.0 | 0 |
| 918.0 | 0 |
| 917.0 | 0 |
| 916.0 | 0 |
| 915.0 | 0 |
| 914.0 | 0 |
| 913.0 | 0 |
| 912.0 | 0 |
| 911.0 | 0 |
| 910.0 | 0 |
| 909.0 | 0 |
| 908.0 | 0 |
| 907.0 | 0 |
| 906.0 | 0 |
| 905.0 | 0 |
| 904.0 | 0 |
| 903.0 | 0 |
| 902.0 | 0 |
| 901.0 | 0 |
| 900.0 | 0 |
| 899.0 | 0 |
| 898.0 | 0 |
| 897.0 | 0 |
| 896.0 | 0 |
| 895.0 | 0 |
| 894.0 | 0 |
| 893.0 | 0 |
| 892.0 | 0 |
| 891.0 | 0 |
| 890.0 | 0 |
| 889.0 | 0 |
| 888.0 | 0 |
| 887.0 | 0 |
| 886.0 | 0 |
| 885.0 | 0 |
| 884.0 | 0 |
| 883.0 | 0 |
| 882.0 | 0 |
| 881.0 | 0 |
| 880.0 | 0 |
| 879.0 | 0 |
| 878.0 | 0 |
| 877.0 | 0 |
| 876.0 | 0 |
| 875.0 | 0 |
| 874.0 | 0 |
| 873.0 | 0 |
| 872.0 | 0 |
| 871.0 | 0 |
| 870.0 | 0 |
| 869.0 | 0 |
| 868.0 | 0 |
| 867.0 | 0 |
| 866.0 | 0 |
| 865.0 | 0 |
| 864.0 | 0 |
| 863.0 | 0 |
| 862.0 | 0 |
| 861.0 | 0 |
| 860.0 | 0 |
| 859.0 | 0 |
| 858.0 | 0 |
| 857.0 | 0 |
| 856.0 | 0 |
| 855.0 | 0 |
| 854.0 | 0 |
| 853.0 | 0 |
| 852.0 | 0 |
| 851.0 | 0 |
| 850.0 | 0 |
| 849.0 | 0 |
| 848.0 | 0 |
| 847.0 | 0 |
| 846.0 | 0 |
| 845.0 | 0 |
| 844.0 | 0 |
| 843.0 | 0 |
| 842.0 | 0 |
| 841.0 | 0 |
| 840.0 | 0 |
| 839.0 | 0 |
| 838.0 | 0 |
| 837.0 | 0 |
| 836.0 | 0 |
| 835.0 | 0 |
| 834.0 | 0 |
| 833.0 | 0 |
| 832.0 | 0 |
| 831.0 | 0 |
| 830.0 | 0 |
| 829.0 | 0 |
| 828.0 | 0 |
| 827.0 | 0 |
| 826.0 | 0 |
| 825.0 | 0 |
| 824.0 | 0 |
| 823.0 | 0 |
| 822.0 | 0 |
| 821.0 | 0 |
| 820.0 | 0 |
| 819.0 | 0 |
| 818.0 | 0 |
| 817.0 | -0.001 |
| 816.0 | 0 |
| 815.0 | -0.001 |
| 814.0 | 0 |
| 813.0 | -0.001 |
| 812.0 | 0 |
| 811.0 | -0.001 |
| 810.0 | -0.001 |
| 809.0 | -0.001 |
| 808.0 | -0.001 |
| 807.0 | 0 |
| 806.0 | -0.001 |
| 805.0 | -0.001 |
| 804.0 | 0 |
| 803.0 | -0.001 |
| 802.0 | -0.001 |
| 801.0 | -0.001 |
| 800.0 | -0.001 |
| 799.0 | 0 |
| 798.0 | 0 |
| 797.0 | 0 |
| 796.0 | 0 |
| 795.0 | 0 |
| 794.0 | 0 |
| 793.0 | 0 |
| 792.0 | 0 |
| 791.0 | 0 |
| 790.0 | 0 |
| 789.0 | 0 |
| 788.0 | 0 |
| 787.0 | 0 |
| 786.0 | 0 |
| 785.0 | 0 |
| 784.0 | 0 |
| 783.0 | 0 |
| 782.0 | 0 |
| 781.0 | 0 |
| 780.0 | 0 |
| 779.0 | 0 |
| 778.0 | 0 |
| 777.0 | 0 |
| 776.0 | 0 |
| 775.0 | 0 |
| 774.0 | 0 |
| 773.0 | 0 |
| 772.0 | 0 |
| 771.0 | 0 |
| 770.0 | 0 |
| 769.0 | 0 |
| 768.0 | 0 |
| 767.0 | 0 |
| 766.0 | 0 |
| 765.0 | 0 |
| 764.0 | 0 |
| 763.0 | 0 |
| 762.0 | 0 |
| 761.0 | 0 |
| 760.0 | 0 |
| 759.0 | 0 |
| 758.0 | 0 |
| 757.0 | 0 |
| 756.0 | 0 |
| 755.0 | 0 |
| 754.0 | 0 |
| 753.0 | 0 |
| 752.0 | 0 |
| 751.0 | 0 |
| 750.0 | 0 |
| 749.0 | 0 |
| 748.0 | 0 |
| 747.0 | 0 |
| 746.0 | 0 |
| 745.0 | 0 |
| 744.0 | 0 |
| 743.0 | 0 |
| 742.0 | 0 |
| 741.0 | 0 |
| 740.0 | 0 |
| 739.0 | 0 |
| 738.0 | 0 |
| 737.0 | 0 |
| 736.0 | 0 |
| 735.0 | 0 |
| 734.0 | 0 |
| 733.0 | 0 |
| 732.0 | 0.001 |
| 731.0 | 0.001 |
| 730.0 | 0.001 |
| 729.0 | 0 |
| 728.0 | 0 |
| 727.0 | 0 |
| 726.0 | 0 |
| 725.0 | 0 |
| 724.0 | 0 |
| 723.0 | 0 |
| 722.0 | 0 |
| 721.0 | 0.001 |
| 720.0 | 0.001 |
| 719.0 | 0.001 |
| 718.0 | 0.001 |
| 717.0 | 0 |
| 716.0 | 0 |
| 715.0 | 0 |
| 714.0 | 0 |
| 713.0 | 0 |
| 712.0 | 0 |
| 711.0 | 0 |
| 710.0 | 0 |
| 709.0 | 0 |
| 708.0 | 0 |
| 707.0 | 0 |
| 706.0 | 0 |
| 705.0 | 0 |
| 704.0 | 0 |
| 703.0 | 0 |
| 702.0 | 0 |
| 701.0 | 0 |
| 700.0 | 0 |
| 699.0 | 0 |
| 698.0 | 0 |
| 697.0 | 0 |
| 696.0 | 0 |
| 695.0 | 0 |
| 694.0 | 0 |
| 693.0 | 0 |
| 692.0 | 0 |
| 691.0 | 0 |
| 690.0 | 0 |
| 689.0 | 0 |
| 688.0 | 0 |
| 687.0 | 0 |
| 686.0 | 0 |
| 685.0 | 0 |
| 684.0 | 0 |
| 683.0 | 0 |
| 682.0 | 0 |
| 681.0 | 0 |
| 680.0 | 0 |
| 679.0 | 0 |
| 678.0 | 0 |
| 677.0 | 0 |
| 676.0 | 0 |
| 675.0 | 0 |
| 674.0 | 0 |
| 673.0 | 0 |
| 672.0 | 0 |
| 671.0 | 0 |
| 670.0 | 0 |
| 669.0 | 0 |
| 668.0 | 0 |
| 667.0 | 0 |
| 666.0 | 0 |
| 665.0 | 0 |
| 664.0 | 0 |
| 663.0 | 0 |
| 662.0 | 0 |
| 661.0 | 0 |
| 660.0 | 0 |
| 659.0 | 0 |
| 658.0 | 0 |
| 657.0 | 0 |
| 656.0 | 0 |
| 655.0 | 0 |
| 654.0 | 0 |
| 653.0 | 0 |
| 652.0 | 0 |
| 651.0 | 0 |
| 650.0 | 0 |
| 649.0 | 0 |
| 648.0 | 0 |
| 647.0 | 0 |
| 646.0 | 0 |
| 645.0 | 0 |
| 644.0 | 0 |
| 643.0 | 0 |
| 642.0 | 0 |
| 641.0 | 0 |
| 640.0 | 0 |
| 639.0 | 0 |
| 638.0 | 0 |
| 637.0 | 0 |
| 636.0 | 0 |
| 635.0 | 0 |
| 634.0 | 0 |
| 633.0 | 0 |
| 632.0 | 0 |
| 631.0 | 0 |
| 630.0 | 0 |
| 629.0 | 0 |
| 628.0 | 0 |
| 627.0 | 0 |
| 626.0 | 0 |
| 625.0 | 0 |
| 624.0 | 0 |
| 623.0 | 0 |
| 622.0 | 0 |
| 621.0 | 0 |
| 620.0 | 0 |
| 619.0 | 0 |
| 618.0 | 0 |
| 617.0 | 0 |
| 616.0 | 0 |
| 615.0 | 0 |
| 614.0 | 0 |
| 613.0 | 0 |
| 612.0 | 0 |
| 611.0 | 0 |
| 610.0 | 0 |
| 609.0 | 0 |
| 608.0 | 0 |
| 607.0 | 0 |
| 606.0 | 0 |
| 605.0 | 0 |
| 604.0 | 0 |
| 603.0 | 0 |
| 602.0 | 0 |
| 601.0 | 0 |
| 600.0 | 0 |
| 599.0 | 0 |
| 598.0 | 0 |
| 597.0 | 0 |
| 596.0 | 0 |
| 595.0 | 0 |
| 594.0 | 0 |
| 593.0 | 0 |
| 592.0 | 0 |
| 591.0 | 0 |
| 590.0 | 0 |
| 589.0 | 0 |
| 588.0 | 0 |
| 587.0 | 0 |
| 586.0 | 0 |
| 585.0 | 0 |
| 584.0 | 0 |
| 583.0 | 0 |
| 582.0 | 0 |
| 581.0 | 0 |
| 580.0 | 0 |
| 579.0 | 0 |
| 578.0 | 0 |
| 577.0 | 0 |
| 576.0 | 0 |
| 575.0 | 0 |
| 574.0 | 0 |
| 573.0 | 0 |
| 572.0 | 0 |
| 571.0 | 0 |
| 570.0 | 0 |
| 569.0 | 0 |
| 568.0 | 0 |
| 567.0 | 0 |
| 566.0 | 0 |
| 565.0 | 0 |
| 564.0 | 0 |
| 563.0 | 0 |
| 562.0 | 0 |
| 561.0 | 0 |
| 560.0 | 0 |
| 559.0 | 0 |
| 558.0 | 0 |
| 557.0 | 0 |
| 556.0 | 0 |
| 555.0 | 0 |
| 554.0 | 0 |
| 553.0 | 0 |
| 552.0 | 0 |
| 551.0 | 0 |
| 550.0 | 0 |
| 549.0 | 0 |
| 548.0 | 0 |
| 547.0 | 0 |
| 546.0 | 0 |
| 545.0 | 0 |
| 544.0 | 0 |
| 543.0 | 0 |
| 542.0 | 0 |
| 541.0 | 0 |
| 540.0 | 0 |
| 539.0 | 0 |
| 538.0 | 0 |
| 537.0 | 0 |
| 536.0 | 0 |
| 535.0 | 0 |
| 534.0 | 0 |
| 533.0 | 0 |
| 532.0 | 0 |
| 531.0 | 0 |
| 530.0 | 0 |
| 529.0 | 0 |
| 528.0 | 0 |
| 527.0 | 0 |
| 526.0 | 0 |
| 525.0 | 0 |
| 524.0 | 0 |
| 523.0 | 0 |
| 522.0 | 0 |
| 521.0 | 0 |
| 520.0 | 0 |
| 519.0 | 0 |
| 518.0 | 0 |
| 517.0 | 0 |
| 516.0 | 0 |
| 515.0 | 0 |
| 514.0 | 0 |
| 513.0 | 0 |
| 512.0 | 0 |
| 511.0 | 0 |
| 510.0 | 0 |
| 509.0 | 0 |
| 508.0 | 0 |
| 507.0 | 0 |
| 506.0 | 0 |
| 505.0 | 0 |
| 504.0 | 0 |
| 503.0 | 0 |
| 502.0 | 0 |
| 501.0 | 0 |
| 500.0 | 0 |
| 499.0 | 0 |
| 498.0 | 0 |
| 497.0 | 0 |
| 496.0 | 0 |
| 495.0 | 0 |
| 494.0 | 0 |
| 493.0 | 0 |
| 492.0 | 0 |
| 491.0 | 0 |
| 490.0 | 0 |
| 489.0 | 0 |
| 488.0 | 0 |
| 487.0 | 0 |
| 486.0 | 0 |
| 485.0 | 0 |
| 484.0 | 0 |
| 483.0 | 0 |
| 482.0 | 0 |
| 481.0 | 0 |
| 480.0 | 0 |
| 479.0 | 0 |
| 478.0 | 0 |
| 477.0 | 0 |
| 476.0 | 0 |
| 475.0 | 0 |
| 474.0 | 0 |
| 473.0 | 0 |
| 472.0 | 0 |
| 471.0 | 0 |
| 470.0 | 0 |
| 469.0 | 0 |
| 468.0 | 0 |
| 467.0 | 0 |
| 466.0 | 0 |
| 465.0 | 0 |
| 464.0 | 0 |
| 463.0 | 0 |
| 462.0 | 0 |
| 461.0 | 0 |
| 460.0 | 0 |
| 459.0 | 0 |
| 458.0 | 0 |
| 457.0 | 0 |
| 456.0 | 0 |
| 455.0 | 0 |
| 454.0 | 0 |
| 453.0 | 0 |
| 452.0 | 0 |
| 451.0 | 0 |
| 450.0 | 0 |
| 449.0 | 0 |
| 448.0 | 0 |
| 447.0 | 0 |
| 446.0 | 0 |
| 445.0 | 0 |
| 444.0 | 0 |
| 443.0 | 0 |
| 442.0 | 0 |
| 441.0 | 0 |
| 440.0 | 0 |
| 439.0 | 0 |
| 438.0 | 0 |
| 437.0 | 0 |
| 436.0 | 0 |
| 435.0 | 0 |
| 434.0 | 0 |
| 433.0 | 0 |
| 432.0 | 0 |
| 431.0 | 0 |
| 430.0 | 0 |
| 429.0 | 0 |
| 428.0 | 0 |
| 427.0 | 0 |
| 426.0 | 0 |
| 425.0 | 0 |
| 424.0 | 0 |
| 423.0 | 0 |
| 422.0 | 0 |
| 421.0 | 0 |
| 420.0 | 0 |
| 419.0 | 0 |
| 418.0 | 0 |
| 417.0 | 0 |
| 416.0 | 0 |
| 415.0 | 0 |
| 414.0 | 0 |
| 413.0 | 0 |
| 412.0 | 0 |
| 411.0 | 0 |
| 410.0 | 0 |
| 409.0 | 0 |
| 408.0 | 0 |
| 407.0 | 0 |
| 406.0 | 0 |
| 405.0 | 0 |
| 404.0 | 0 |
| 403.0 | 0 |
| 402.0 | 0 |
| 401.0 | 0 |
| 400.0 | 0 |
| 399.0 | 0 |
| 398.0 | 0 |
| 397.0 | 0 |
| 396.0 | 0 |
| 395.0 | 0 |
| 394.0 | 0 |
| 393.0 | 0 |
| 392.0 | 0 |
| 391.0 | 0 |
| 390.0 | 0 |
| 389.0 | 0 |
| 388.0 | 0 |
| 387.0 | 0 |
| 386.0 | 0 |
| 385.0 | 0 |
| 384.0 | 0 |
| 383.0 | 0 |
| 382.0 | 0 |
| 381.0 | 0 |
| 380.0 | 0 |
| 379.0 | 0 |
| 378.0 | 0 |
| 377.0 | 0 |
| 376.0 | 0 |
| 375.0 | 0 |
| 374.0 | 0 |
| 373.0 | 0 |
| 372.0 | 0 |
| 371.0 | 0 |
| 370.0 | 0 |
| 369.0 | 0 |
| 368.0 | 0 |
| 367.0 | 0 |
| 366.0 | 0 |
| 365.0 | 0 |
| 364.0 | 0 |
| 363.0 | 0 |
| 362.0 | 0 |
| 361.0 | 0 |
| 360.0 | 0 |
| 359.0 | 0 |
| 358.0 | 0 |
| 357.0 | 0 |
| 356.0 | 0 |
| 355.0 | 0 |
| 354.0 | 0 |
| 353.0 | 0 |
| 352.0 | 0 |
| 351.0 | 0 |
| 350.0 | 0 |
| 349.0 | 0 |
| 348.0 | 0 |
| 347.0 | 0 |
| 346.0 | 0 |
| 345.0 | 0 |
| 344.0 | 0 |
| 343.0 | 0 |
| 342.0 | 0 |
| 341.0 | 0 |
| 340.0 | 0 |
| 339.0 | 0 |
| 338.0 | 0 |
| 337.0 | 0 |
| 336.0 | 0 |
| 335.0 | 0 |
| 334.0 | 0 |
| 333.0 | 0 |
| 332.0 | 0 |
| 331.0 | 0 |
| 330.0 | 0 |
| 329.0 | 0 |
| 328.0 | 0 |
| 327.0 | 0 |
| 326.0 | 0 |
| 325.0 | 0 |
| 324.0 | 0 |
| 323.0 | 0 |
| 322.0 | 0 |
| 321.0 | 0 |
| 320.0 | 0 |
| 319.0 | 0 |
| 318.0 | 0 |
| 317.0 | 0 |
| 316.0 | 0 |
| 315.0 | 0 |
| 314.0 | 0 |
| 313.0 | 0 |
| 312.0 | 0 |
| 311.0 | 0 |
| 310.0 | 0 |
| 309.0 | 0 |
| 308.0 | 0 |
| 307.0 | 0 |
| 306.0 | 0 |
| 305.0 | 0 |
| 304.0 | 0 |
| 303.0 | 0 |
| 302.0 | 0 |
| 301.0 | 0 |
| 300.0 | 0 |
| 299.0 | 0 |
| 298.0 | 0 |
| 297.0 | 0 |
| 296.0 | 0 |
| 295.0 | 0 |
| 294.0 | 0 |
| 293.0 | 0 |
| 292.0 | 0 |
| 291.0 | 0 |
| 290.0 | 0 |
| 289.0 | 0 |
| 288.0 | 0 |
| 287.0 | 0 |
| 286.0 | 0 |
| 285.0 | 0 |
| 284.0 | 0 |
| 283.0 | 0 |
| 282.0 | 0 |
| 281.0 | 0 |
| 280.0 | 0 |
| 279.0 | 0 |
| 278.0 | 0 |
| 277.0 | 0 |
| 276.0 | 0 |
| 275.0 | 0 |
| 274.0 | 0 |
| 273.0 | 0 |
| 272.0 | 0 |
| 271.0 | 0 |
| 270.0 | 0 |
| 269.0 | 0 |
| 268.0 | 0 |
| 267.0 | 0 |
| 266.0 | 0 |
| 265.0 | 0 |
| 264.0 | 0 |
| 263.0 | 0 |
| 262.0 | 0 |
| 261.0 | 0 |
| 260.0 | 0 |
| 259.0 | 0 |
| 258.0 | 0 |
| 257.0 | 0 |
| 256.0 | 0 |
| 255.0 | 0 |
| 254.0 | 0 |
| 253.0 | 0 |
| 252.0 | 0 |
| 251.0 | 0 |
| 250.0 | 0 |
| 249.0 | 0 |
| 248.0 | 0 |
| 247.0 | 0 |
| 246.0 | 0 |
| 245.0 | 0 |
| 244.0 | 0 |
| 243.0 | 0 |
| 242.0 | 0 |
| 241.0 | 0 |
| 240.0 | 0 |
| 239.0 | 0 |
| 238.0 | 0 |
| 237.0 | 0 |
| 236.0 | 0 |
| 235.0 | 0 |
| 234.0 | 0 |
| 233.0 | 0 |
| 232.0 | 0 |
| 231.0 | 0 |
| 230.0 | 0 |
| 229.0 | 0 |
| 228.0 | 0 |
| 227.0 | 0 |
| 226.0 | 0 |
| 225.0 | 0 |
| 224.0 | 0 |
| 223.0 | 0 |
| 222.0 | 0 |
| 221.0 | 0 |
| 220.0 | 0 |
| 219.0 | 0 |
| 218.0 | 0 |